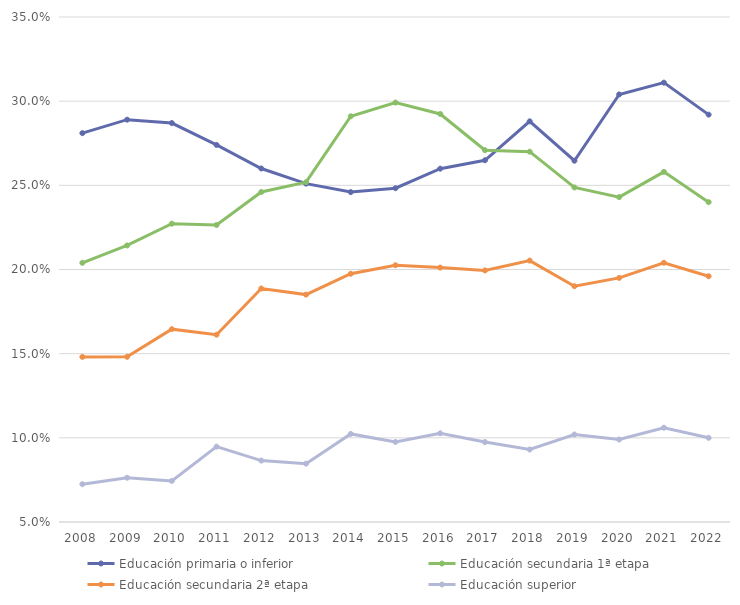
| Category | Educación primaria o inferior | Educación secundaria 1ª etapa | Educación secundaria 2ª etapa | Educación superior |
|---|---|---|---|---|
| 2008.0 | 0.281 | 0.204 | 0.148 | 0.072 |
| 2009.0 | 0.289 | 0.214 | 0.148 | 0.076 |
| 2010.0 | 0.287 | 0.227 | 0.165 | 0.074 |
| 2011.0 | 0.274 | 0.226 | 0.161 | 0.095 |
| 2012.0 | 0.26 | 0.246 | 0.189 | 0.086 |
| 2013.0 | 0.251 | 0.252 | 0.185 | 0.085 |
| 2014.0 | 0.246 | 0.291 | 0.197 | 0.102 |
| 2015.0 | 0.248 | 0.299 | 0.203 | 0.098 |
| 2016.0 | 0.26 | 0.292 | 0.201 | 0.103 |
| 2017.0 | 0.265 | 0.271 | 0.199 | 0.097 |
| 2018.0 | 0.288 | 0.27 | 0.205 | 0.093 |
| 2019.0 | 0.265 | 0.249 | 0.19 | 0.102 |
| 2020.0 | 0.304 | 0.243 | 0.195 | 0.099 |
| 2021.0 | 0.311 | 0.258 | 0.204 | 0.106 |
| 2022.0 | 0.292 | 0.24 | 0.196 | 0.1 |